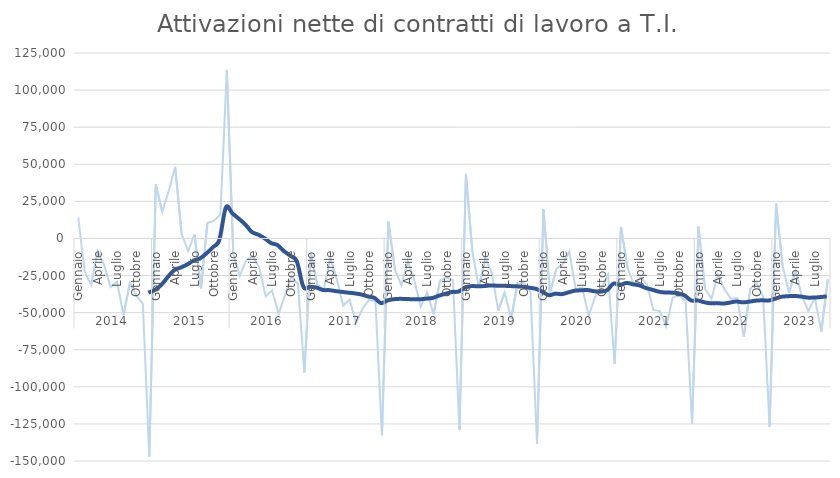
| Category | T.I. |
|---|---|
| 0 | 14190 |
| 1 | -22442 |
| 2 | -31377 |
| 3 | -8370 |
| 4 | -17642 |
| 5 | -32814 |
| 6 | -29158 |
| 7 | -51761 |
| 8 | -29966 |
| 9 | -38609 |
| 10 | -43946 |
| 11 | -146899 |
| 12 | 36405 |
| 13 | 17920 |
| 14 | 31955 |
| 15 | 48239 |
| 16 | 3137 |
| 17 | -8474 |
| 18 | 2512 |
| 19 | -33662 |
| 20 | 10604 |
| 21 | 11819 |
| 22 | 16124 |
| 23 | 113641 |
| 24 | -10616 |
| 25 | -25051 |
| 26 | -14824 |
| 27 | -11863 |
| 28 | -19292 |
| 29 | -38842 |
| 30 | -35032 |
| 31 | -50843 |
| 32 | -38314 |
| 33 | -25706 |
| 34 | -30707 |
| 35 | -90324 |
| 36 | -10116 |
| 37 | -31100 |
| 38 | -34488 |
| 39 | -13283 |
| 40 | -27237 |
| 41 | -45241 |
| 42 | -41233 |
| 43 | -57064 |
| 44 | -47141 |
| 45 | -41369 |
| 46 | -42228 |
| 47 | -132698 |
| 48 | 11417 |
| 49 | -20745 |
| 50 | -31582 |
| 51 | -15223 |
| 52 | -28038 |
| 53 | -45987 |
| 54 | -36372 |
| 55 | -51161 |
| 56 | -28258 |
| 57 | -26186 |
| 58 | -28050 |
| 59 | -129202 |
| 60 | 43491 |
| 61 | -8986 |
| 62 | -32884 |
| 63 | -13298 |
| 64 | -22997 |
| 65 | -48456 |
| 66 | -36485 |
| 67 | -53977 |
| 68 | -29884 |
| 69 | -29858 |
| 70 | -36106 |
| 71 | -138359 |
| 72 | 19877 |
| 73 | -36539 |
| 74 | -20478 |
| 75 | -17228 |
| 76 | -9050 |
| 77 | -34487 |
| 78 | -33147 |
| 79 | -52207 |
| 80 | -39303 |
| 81 | -33144 |
| 82 | -24421 |
| 83 | -84609 |
| 84 | 7759 |
| 85 | -19434 |
| 86 | -31286 |
| 87 | -26142 |
| 88 | -30689 |
| 89 | -48180 |
| 90 | -48940 |
| 91 | -59290 |
| 92 | -39895 |
| 93 | -38246 |
| 94 | -42177 |
| 95 | -124759 |
| 96 | 7995 |
| 97 | -33879 |
| 98 | -40614 |
| 99 | -24335 |
| 100 | -34174 |
| 101 | -40566 |
| 102 | -40161 |
| 103 | -66286 |
| 104 | -33971 |
| 105 | -30167 |
| 106 | -39360 |
| 107 | -126872 |
| 108 | 23430 |
| 109 | -18161 |
| 110 | -36717 |
| 111 | -21898 |
| 112 | -39238 |
| 113 | -48809 |
| 114 | -39893 |
| 115 | -62838 |
| 116 | -27648 |